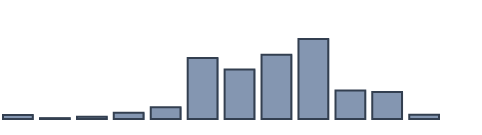
| Category | Series 0 |
|---|---|
| 0 | 1.211 |
| 1 | 0.254 |
| 2 | 0.689 |
| 3 | 1.853 |
| 4 | 3.457 |
| 5 | 17.924 |
| 6 | 14.559 |
| 7 | 18.899 |
| 8 | 23.557 |
| 9 | 8.41 |
| 10 | 7.966 |
| 11 | 1.22 |
| 12 | 0 |